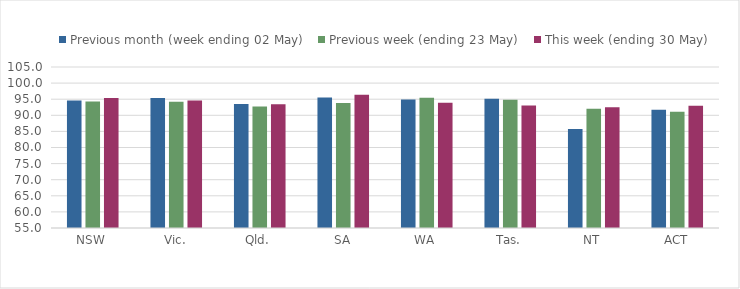
| Category | Previous month (week ending 02 May) | Previous week (ending 23 May) | This week (ending 30 May) |
|---|---|---|---|
| NSW | 94.588 | 94.263 | 95.399 |
| Vic. | 95.367 | 94.177 | 94.606 |
| Qld. | 93.502 | 92.757 | 93.428 |
| SA | 95.492 | 93.808 | 96.418 |
| WA | 94.9 | 95.413 | 93.924 |
| Tas. | 95.157 | 94.808 | 93.037 |
| NT | 85.769 | 92.03 | 92.516 |
| ACT | 91.685 | 91.131 | 92.953 |